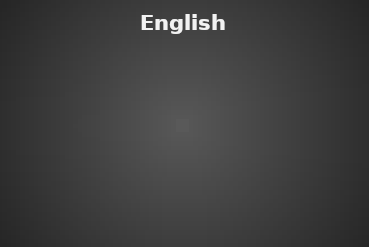
| Category | English Grammar |
|---|---|
| % of Students passed | 0 |
| % of Students need improvement | 0 |